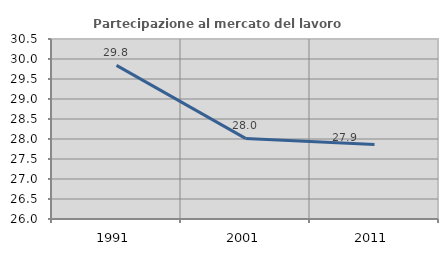
| Category | Partecipazione al mercato del lavoro  femminile |
|---|---|
| 1991.0 | 29.84 |
| 2001.0 | 28.015 |
| 2011.0 | 27.864 |